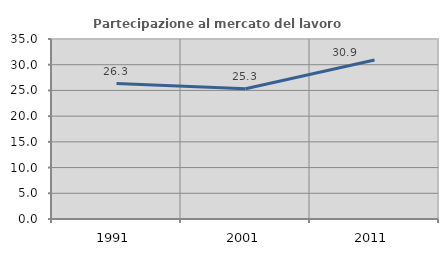
| Category | Partecipazione al mercato del lavoro  femminile |
|---|---|
| 1991.0 | 26.333 |
| 2001.0 | 25.328 |
| 2011.0 | 30.928 |